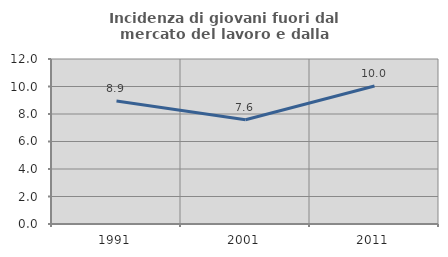
| Category | Incidenza di giovani fuori dal mercato del lavoro e dalla formazione  |
|---|---|
| 1991.0 | 8.939 |
| 2001.0 | 7.586 |
| 2011.0 | 10.04 |